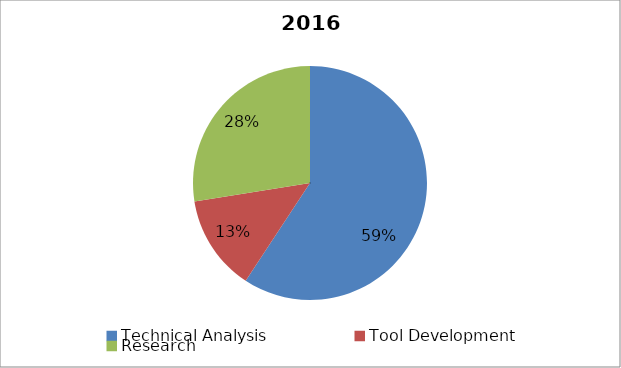
| Category | 2014 Breakdown |
|---|---|
| Technical Analysis | 0.593 |
| Tool Development, Research, Regional Coordination  | 0.132 |
| Administration | 0.275 |